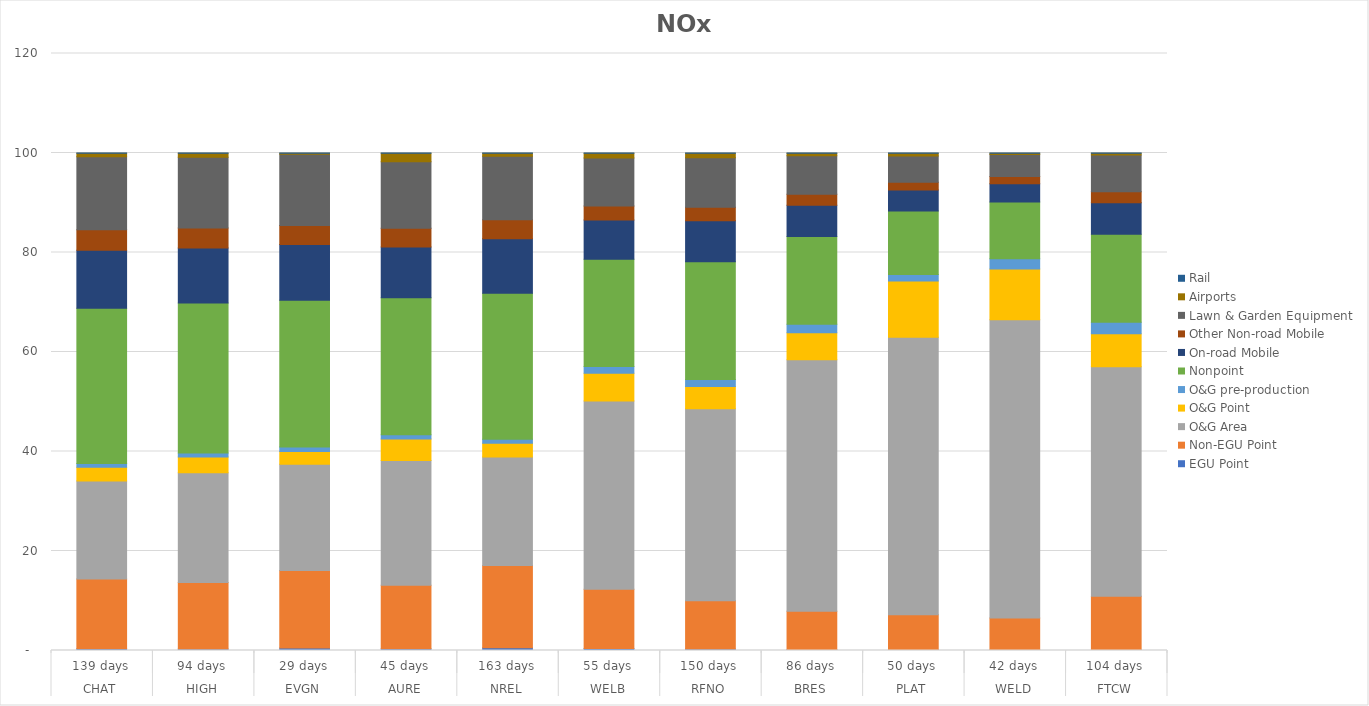
| Category | EGU Point | Non-EGU Point | O&G Area | O&G Point | O&G pre-production | Nonpoint | On-road Mobile | Other Non-road Mobile | Lawn & Garden Equipment | Airports | Rail |
|---|---|---|---|---|---|---|---|---|---|---|---|
| 0 | 0.348 | 14.009 | 19.69 | 2.771 | 0.76 | 31.197 | 11.679 | 4.116 | 14.691 | 0.678 | 0.061 |
| 1 | 0.307 | 13.361 | 22.074 | 3.169 | 0.774 | 30.168 | 11.069 | 3.984 | 14.235 | 0.806 | 0.054 |
| 2 | 0.515 | 15.584 | 21.356 | 2.56 | 0.911 | 29.487 | 11.18 | 3.859 | 14.308 | 0.176 | 0.064 |
| 3 | 0.332 | 12.784 | 25.059 | 4.332 | 0.861 | 27.513 | 10.208 | 3.796 | 13.374 | 1.673 | 0.066 |
| 4 | 0.565 | 16.522 | 21.821 | 2.732 | 0.822 | 29.343 | 10.972 | 3.815 | 12.752 | 0.588 | 0.07 |
| 5 | 0.388 | 11.946 | 37.826 | 5.586 | 1.338 | 21.583 | 7.869 | 2.833 | 9.603 | 0.969 | 0.058 |
| 6 | 0.315 | 9.696 | 38.603 | 4.442 | 1.391 | 23.677 | 8.239 | 2.734 | 9.931 | 0.917 | 0.055 |
| 7 | 0.184 | 7.715 | 50.564 | 5.41 | 1.709 | 17.643 | 6.266 | 2.203 | 7.735 | 0.524 | 0.048 |
| 8 | 0.161 | 7.042 | 55.741 | 11.327 | 1.323 | 12.772 | 4.197 | 1.551 | 5.296 | 0.552 | 0.037 |
| 9 | 0.084 | 6.473 | 59.95 | 10.197 | 2.029 | 11.4 | 3.708 | 1.423 | 4.428 | 0.269 | 0.04 |
| 10 | 0.113 | 10.806 | 46.11 | 6.627 | 2.326 | 17.706 | 6.324 | 2.176 | 7.389 | 0.369 | 0.054 |